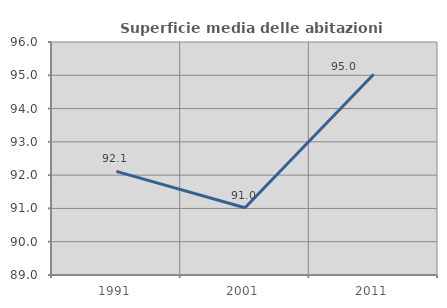
| Category | Superficie media delle abitazioni occupate |
|---|---|
| 1991.0 | 92.115 |
| 2001.0 | 91.021 |
| 2011.0 | 95.029 |